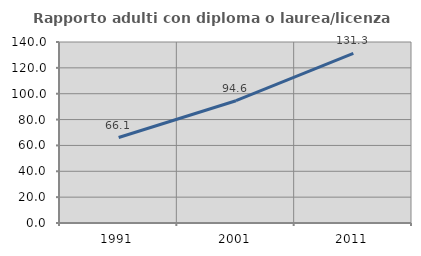
| Category | Rapporto adulti con diploma o laurea/licenza media  |
|---|---|
| 1991.0 | 66.102 |
| 2001.0 | 94.592 |
| 2011.0 | 131.25 |